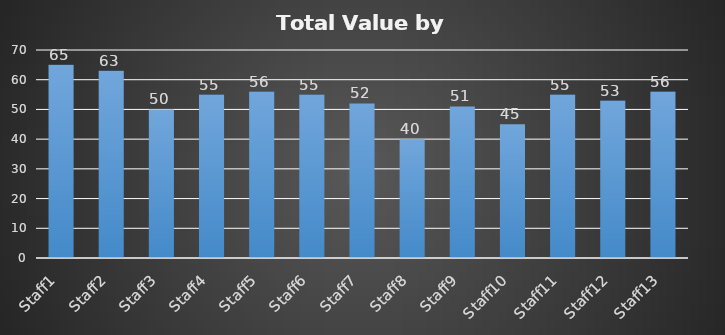
| Category | Series 0 |
|---|---|
| Staff1 | 65 |
| Staff2 | 63 |
| Staff3 | 50 |
| Staff4 | 55 |
| Staff5 | 56 |
| Staff6 | 55 |
| Staff7 | 52 |
| Staff8 | 40 |
| Staff9 | 51 |
| Staff10 | 45 |
| Staff11 | 55 |
| Staff12 | 53 |
| Staff13 | 56 |